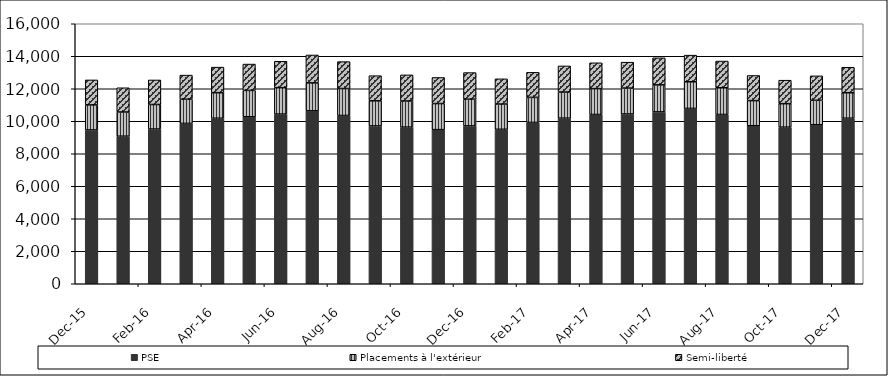
| Category | PSE | Placements à l'extérieur | Semi-liberté |
|---|---|---|---|
| 2015-12-01 | 9466 | 1539 | 1539 |
| 2016-01-01 | 9081 | 1490 | 1490 |
| 2016-02-01 | 9521 | 1510 | 1510 |
| 2016-03-01 | 9868 | 1486 | 1486 |
| 2016-04-01 | 10187 | 1572 | 1572 |
| 2016-05-01 | 10278 | 1621 | 1621 |
| 2016-06-01 | 10441 | 1625 | 1625 |
| 2016-07-01 | 10642 | 1718 | 1718 |
| 2016-08-01 | 10355 | 1658 | 1658 |
| 2016-09-01 | 9712 | 1546 | 1546 |
| 2016-10-01 | 9640 | 1607 | 1607 |
| 2016-11-01 | 9484 | 1605 | 1605 |
| 2016-12-01 | 9714 | 1641 | 1641 |
| 2017-01-01 | 9505 | 1553 | 1553 |
| 2017-02-01 | 9927 | 1542 | 1542 |
| 2017-03-01 | 10190 | 1607 | 1607 |
| 2017-04-01 | 10417 | 1590 | 1590 |
| 2017-05-01 | 10448 | 1594 | 1594 |
| 2017-06-01 | 10575 | 1664 | 1664 |
| 2017-07-01 | 10791 | 1639 | 1639 |
| 2017-08-01 | 10417 | 1644 | 1644 |
| 2017-09-01 | 9723 | 1547 | 1547 |
| 2017-10-01 | 9637 | 1445 | 1445 |
| 2017-11-01 | 9787 | 1504 | 1504 |
| 2017-12-01 | 10187 | 1568 | 1568 |